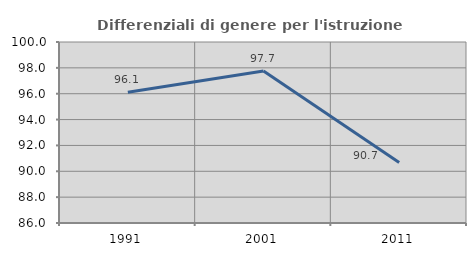
| Category | Differenziali di genere per l'istruzione superiore |
|---|---|
| 1991.0 | 96.111 |
| 2001.0 | 97.749 |
| 2011.0 | 90.686 |